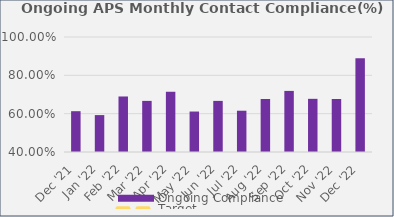
| Category | Ongoing Compliance |
|---|---|
| Dec '21 | 0.613 |
| Jan '22 | 0.593 |
| Feb '22 | 0.69 |
| Mar '22 | 0.667 |
| Apr '22 | 0.714 |
| May '22 | 0.611 |
| Jun '22 | 0.667 |
| Jul '22 | 0.615 |
| Aug '22 | 0.676 |
| Sep '22 | 0.719 |
| Oct '22 | 0.677 |
| Nov '22 | 0.676 |
| Dec '22 | 0.889 |